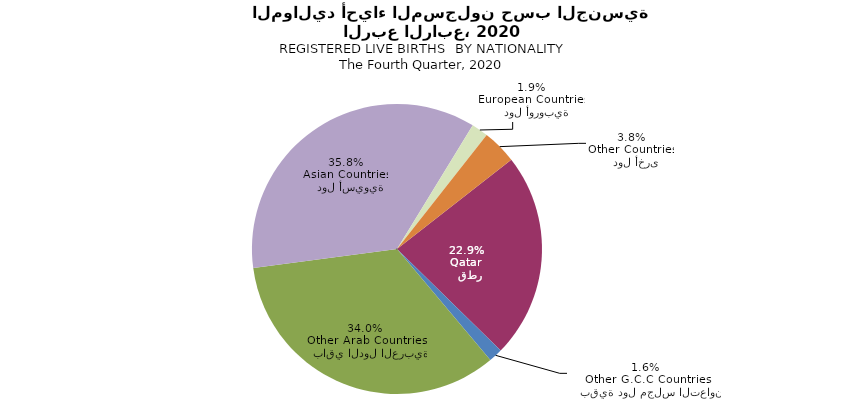
| Category | Series 0 |
|---|---|
|   قطر
Qatar | 1594 |
|   بقية دول مجلس التعاون
Other G.C.C Countries | 108 |
|   باقي الدول العربية
Other Arab Countries | 2371 |
|   دول أسيوية
Asian Countries | 2497 |
|   دول أوروبية
European Countries | 130 |
|   دول أخرى
Other Countries | 267 |